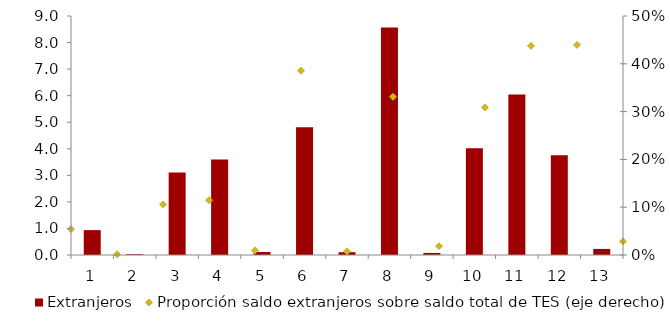
| Category | Extranjeros |
|---|---|
| 0 | 0.937 |
| 1 | 0.029 |
| 2 | 3.108 |
| 3 | 3.6 |
| 4 | 0.115 |
| 5 | 4.81 |
| 6 | 0.106 |
| 7 | 8.57 |
| 8 | 0.078 |
| 9 | 4.02 |
| 10 | 6.04 |
| 11 | 3.76 |
| 12 | 0.229 |